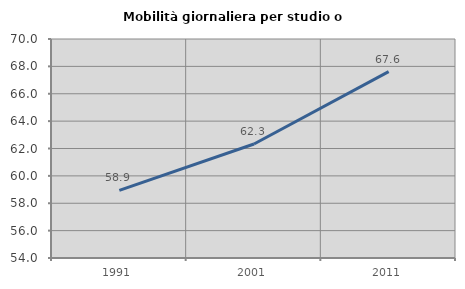
| Category | Mobilità giornaliera per studio o lavoro |
|---|---|
| 1991.0 | 58.94 |
| 2001.0 | 62.331 |
| 2011.0 | 67.617 |